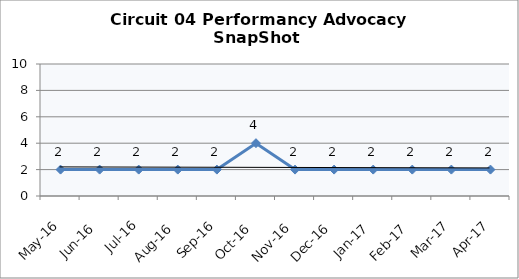
| Category | Circuit 04 |
|---|---|
| May-16 | 2 |
| Jun-16 | 2 |
| Jul-16 | 2 |
| Aug-16 | 2 |
| Sep-16 | 2 |
| Oct-16 | 4 |
| Nov-16 | 2 |
| Dec-16 | 2 |
| Jan-17 | 2 |
| Feb-17 | 2 |
| Mar-17 | 2 |
| Apr-17 | 2 |